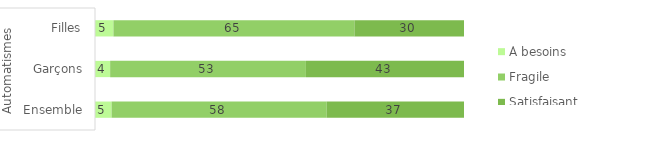
| Category | À besoins | Fragile | Satisfaisant |
|---|---|---|---|
| 0 | 4.5 | 58.3 | 37.2 |
| 1 | 4.1 | 53 | 42.8 |
| 2 | 5 | 65.3 | 29.7 |